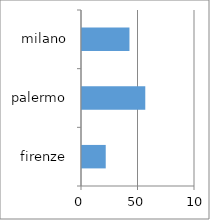
| Category | Series 0 |
|---|---|
| firenze | 21 |
| palermo | 56 |
| milano | 42 |